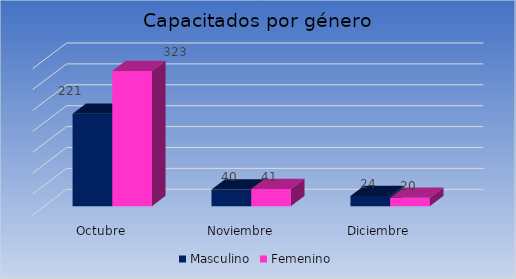
| Category | Masculino | Femenino |
|---|---|---|
| Octubre | 221 | 323 |
| Noviembre | 40 | 41 |
| Diciembre | 24 | 20 |